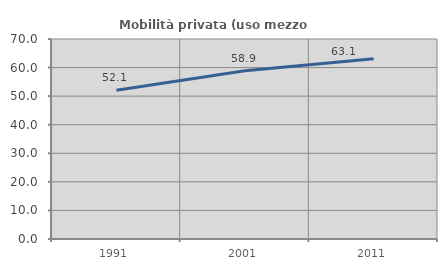
| Category | Mobilità privata (uso mezzo privato) |
|---|---|
| 1991.0 | 52.065 |
| 2001.0 | 58.922 |
| 2011.0 | 63.119 |